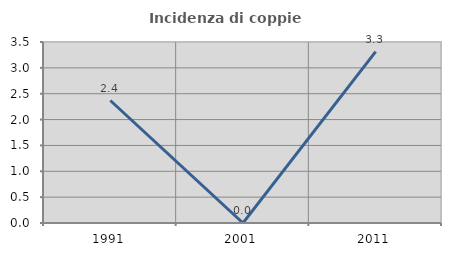
| Category | Incidenza di coppie miste |
|---|---|
| 1991.0 | 2.368 |
| 2001.0 | 0 |
| 2011.0 | 3.313 |